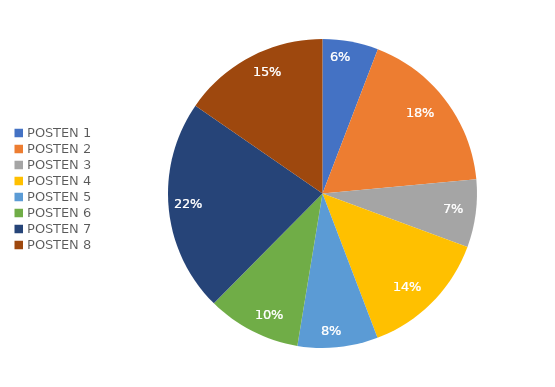
| Category | Series 0 | Series 1 |
|---|---|---|
| POSTEN 1 | 0.058 | 0.058 |
| POSTEN 2 | 0.177 | 0.177 |
| POSTEN 3 | 0.071 | 0.071 |
| POSTEN 4 | 0.136 | 0.136 |
| POSTEN 5 | 0.084 | 0.084 |
| POSTEN 6 | 0.098 | 0.098 |
| POSTEN 7 | 0.222 | 0.222 |
| POSTEN 8 | 0.154 | 0.154 |